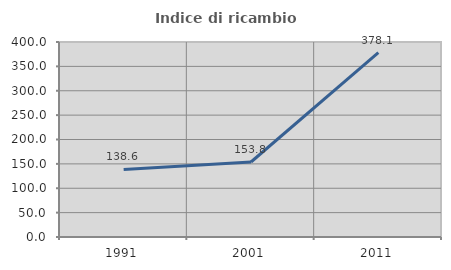
| Category | Indice di ricambio occupazionale  |
|---|---|
| 1991.0 | 138.596 |
| 2001.0 | 153.846 |
| 2011.0 | 378.125 |